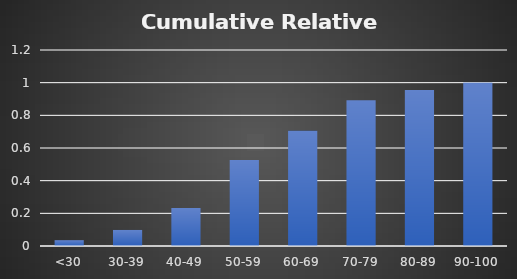
| Category | Cumulative Relative Frequency |
|---|---|
| <30 | 0.036 |
| 30-39 | 0.098 |
| 40-49 | 0.232 |
| 50-59 | 0.527 |
| 60-69 | 0.705 |
| 70-79 | 0.893 |
| 80-89 | 0.955 |
| 90-100 | 1 |